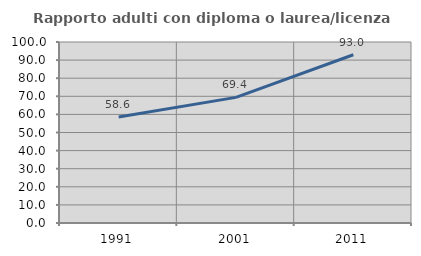
| Category | Rapporto adulti con diploma o laurea/licenza media  |
|---|---|
| 1991.0 | 58.576 |
| 2001.0 | 69.397 |
| 2011.0 | 92.969 |